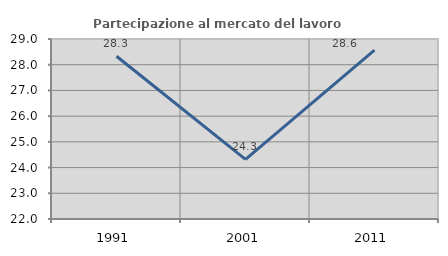
| Category | Partecipazione al mercato del lavoro  femminile |
|---|---|
| 1991.0 | 28.33 |
| 2001.0 | 24.318 |
| 2011.0 | 28.571 |